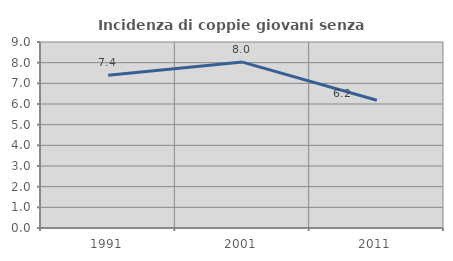
| Category | Incidenza di coppie giovani senza figli |
|---|---|
| 1991.0 | 7.39 |
| 2001.0 | 8.029 |
| 2011.0 | 6.182 |